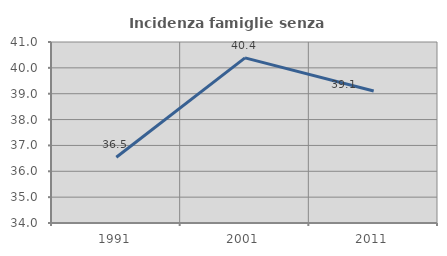
| Category | Incidenza famiglie senza nuclei |
|---|---|
| 1991.0 | 36.545 |
| 2001.0 | 40.385 |
| 2011.0 | 39.104 |